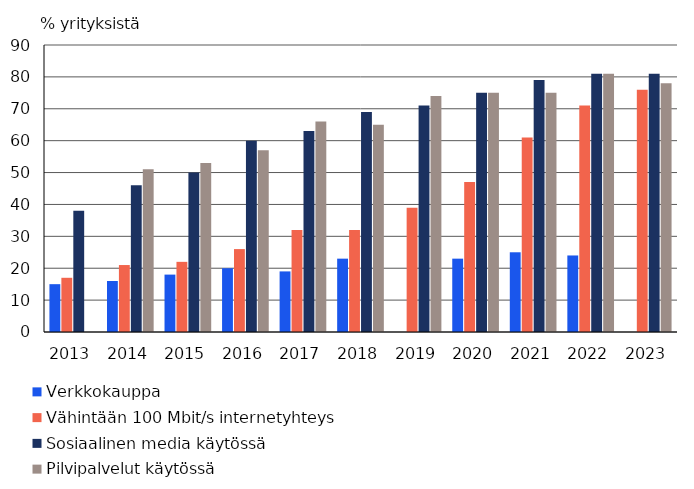
| Category | Verkkokauppa | Vähintään 100 Mbit/s internetyhteys | Sosiaalinen media käytössä | Pilvipalvelut käytössä |
|---|---|---|---|---|
| 2013.0 | 15 | 17 | 38 | 0 |
| 2014.0 | 16 | 21 | 46 | 51 |
| 2015.0 | 18 | 22 | 50 | 53 |
| 2016.0 | 20 | 26 | 60 | 57 |
| 2017.0 | 19 | 32 | 63 | 66 |
| 2018.0 | 23 | 32 | 69 | 65 |
| 2019.0 | 0 | 39 | 71 | 74 |
| 2020.0 | 23 | 47 | 75 | 75 |
| 2021.0 | 25 | 61 | 79 | 75 |
| 2022.0 | 24 | 71 | 81 | 81 |
| 2023.0 | 0 | 76 | 81 | 78 |